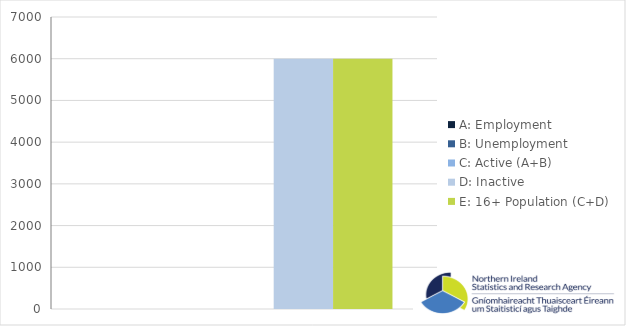
| Category | A: Employment | B: Unemployment | C: Active (A+B) | D: Inactive | E: 16+ Population (C+D) |
|---|---|---|---|---|---|
| 0 | 0 | 0 | 0 | 6000 | 6000 |